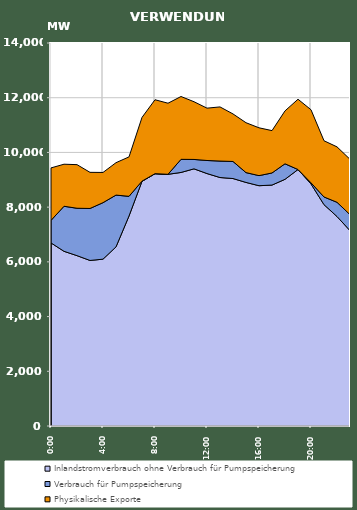
| Category | Inlandstromverbrauch ohne Verbrauch für Pumpspeicherung | Verbrauch für Pumpspeicherung | Physikalische Exporte |
|---|---|---|---|
| 2007-01-17 | 6692.303 | 822.728 | 1918.864 |
| 2007-01-17 01:00:00 | 6385.951 | 1646.29 | 1537.326 |
| 2007-01-17 02:00:00 | 6227.153 | 1732.133 | 1594.034 |
| 2007-01-17 03:00:00 | 6050.754 | 1900.269 | 1321.301 |
| 2007-01-17 04:00:00 | 6098.398 | 2065.56 | 1104.302 |
| 2007-01-17 05:00:00 | 6546.704 | 1894.01 | 1184.486 |
| 2007-01-17 06:00:00 | 7675.728 | 718.478 | 1442.24 |
| 2007-01-17 07:00:00 | 8945.261 | 5.279 | 2329.244 |
| 2007-01-17 08:00:00 | 9222.747 | 1.171 | 2701.906 |
| 2007-01-17 09:00:00 | 9199.904 | 0.58 | 2598.354 |
| 2007-01-17 10:00:00 | 9267.574 | 479.982 | 2296.369 |
| 2007-01-17 11:00:00 | 9400.233 | 343.485 | 2109.82 |
| 2007-01-17 12:00:00 | 9227.73 | 477.262 | 1913.395 |
| 2007-01-17 13:00:00 | 9082.411 | 601.654 | 1979.523 |
| 2007-01-17 14:00:00 | 9045.393 | 624.087 | 1738.025 |
| 2007-01-17 15:00:00 | 8903.089 | 359.27 | 1823.949 |
| 2007-01-17 16:00:00 | 8783.315 | 368.496 | 1748.026 |
| 2007-01-17 17:00:00 | 8806.876 | 442.654 | 1547.844 |
| 2007-01-17 18:00:00 | 9017.085 | 567.429 | 1933.645 |
| 2007-01-17 19:00:00 | 9374.444 | 1.282 | 2568.893 |
| 2007-01-17 20:00:00 | 8848.8 | 40.467 | 2670.592 |
| 2007-01-17 21:00:00 | 8090.739 | 281.576 | 2054.096 |
| 2007-01-17 22:00:00 | 7657.61 | 519.617 | 2026.03 |
| 2007-01-17 23:00:00 | 7141.488 | 584.035 | 2023.446 |